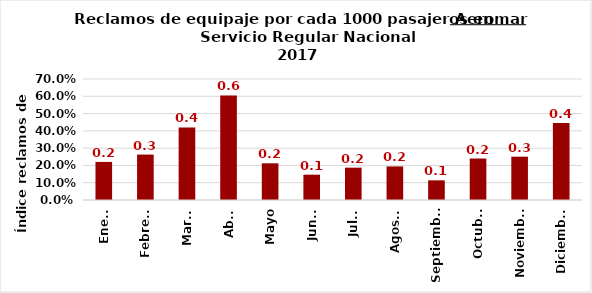
| Category | Reclamos por cada 1000 pasajeros |
|---|---|
| Enero | 0.22 |
| Febrero | 0.263 |
| Marzo | 0.42 |
| Abril | 0.605 |
| Mayo | 0.212 |
| Junio | 0.147 |
| Julio | 0.187 |
| Agosto | 0.194 |
| Septiembre | 0.114 |
| Octubre | 0.24 |
| Noviembre | 0.251 |
| Diciembre | 0.446 |